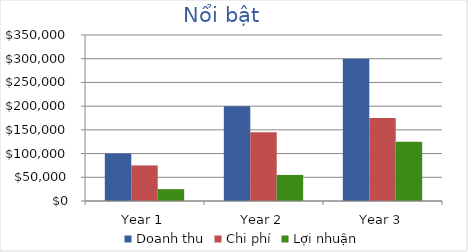
| Category | Doanh thu | Chi phí | Lợi nhuận |
|---|---|---|---|
| Year 1 | 100000 | 75000 | 25000 |
| Year 2 | 200000 | 145000 | 55000 |
| Year 3 | 300000 | 175000 | 125000 |